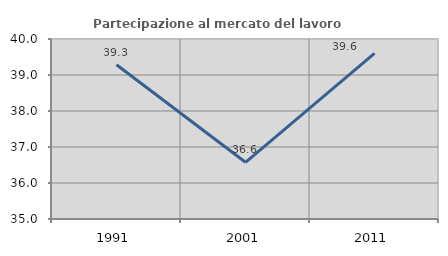
| Category | Partecipazione al mercato del lavoro  femminile |
|---|---|
| 1991.0 | 39.284 |
| 2001.0 | 36.575 |
| 2011.0 | 39.603 |